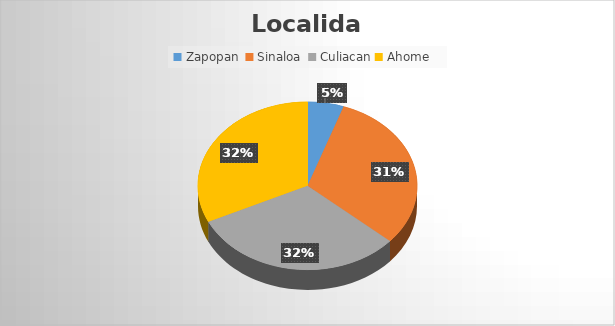
| Category | Suma |
|---|---|
| Zapopan  | 100224 |
| Sinaloa  | 585940.96 |
| Culiacan | 593250.8 |
| Ahome | 603406.37 |